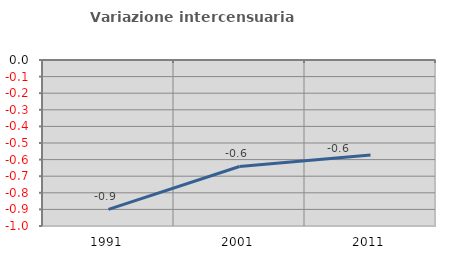
| Category | Variazione intercensuaria annua |
|---|---|
| 1991.0 | -0.9 |
| 2001.0 | -0.641 |
| 2011.0 | -0.572 |